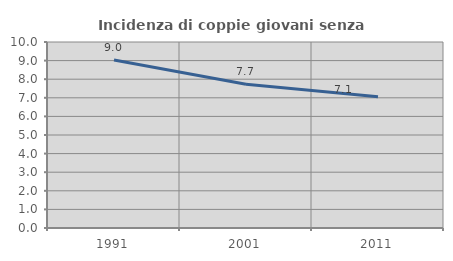
| Category | Incidenza di coppie giovani senza figli |
|---|---|
| 1991.0 | 9.036 |
| 2001.0 | 7.724 |
| 2011.0 | 7.053 |